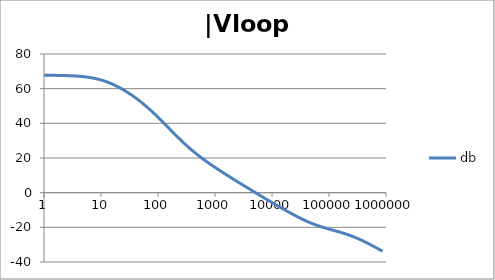
| Category | db |
|---|---|
| 1.0 | 67.728 |
| 1.0715193052376064 | 67.722 |
| 1.1481536214968828 | 67.716 |
| 1.2302687708123814 | 67.709 |
| 1.318256738556407 | 67.7 |
| 1.4125375446227544 | 67.691 |
| 1.513561248436208 | 67.68 |
| 1.6218100973589298 | 67.668 |
| 1.7378008287493754 | 67.653 |
| 1.8620871366628673 | 67.637 |
| 1.9952623149688797 | 67.618 |
| 2.1379620895022318 | 67.597 |
| 2.2908676527677727 | 67.573 |
| 2.45470891568503 | 67.545 |
| 2.6302679918953817 | 67.513 |
| 2.8183829312644537 | 67.477 |
| 3.0199517204020156 | 67.436 |
| 3.235936569296282 | 67.389 |
| 3.467368504525316 | 67.336 |
| 3.7153522909717256 | 67.276 |
| 3.9810717055349727 | 67.208 |
| 4.265795188015926 | 67.131 |
| 4.570881896148749 | 67.044 |
| 4.897788193684462 | 66.946 |
| 5.2480746024977245 | 66.836 |
| 5.62341325190349 | 66.713 |
| 6.025595860743575 | 66.575 |
| 6.456542290346554 | 66.423 |
| 6.918309709189363 | 66.253 |
| 7.4131024130091765 | 66.066 |
| 7.943282347242814 | 65.859 |
| 8.511380382023765 | 65.633 |
| 9.120108393559095 | 65.386 |
| 9.772372209558105 | 65.117 |
| 10.47128548050899 | 64.826 |
| 11.22018454301963 | 64.513 |
| 12.022644346174127 | 64.176 |
| 12.88249551693134 | 63.817 |
| 13.803842646028851 | 63.434 |
| 14.791083881682074 | 63.028 |
| 15.848931924611136 | 62.599 |
| 16.98243652461744 | 62.148 |
| 18.197008586099834 | 61.676 |
| 19.498445997580447 | 61.181 |
| 20.892961308540382 | 60.665 |
| 22.387211385683386 | 60.128 |
| 23.988329190194897 | 59.571 |
| 25.703957827688622 | 58.994 |
| 27.54228703338165 | 58.396 |
| 29.51209226666385 | 57.778 |
| 31.62277660168379 | 57.14 |
| 33.884415613920254 | 56.482 |
| 36.307805477010106 | 55.804 |
| 38.90451449942804 | 55.104 |
| 41.686938347033525 | 54.384 |
| 44.6683592150963 | 53.643 |
| 47.86300923226381 | 52.881 |
| 51.28613839913647 | 52.098 |
| 54.95408738576247 | 51.293 |
| 58.88436553555889 | 50.467 |
| 63.09573444801931 | 49.62 |
| 67.60829753919813 | 48.752 |
| 72.44359600749901 | 47.866 |
| 77.62471166286915 | 46.96 |
| 83.17637711026705 | 46.037 |
| 89.12509381337456 | 45.098 |
| 95.49925860214357 | 44.143 |
| 102.32929922807544 | 43.176 |
| 109.64781961431841 | 42.197 |
| 117.48975549395293 | 41.21 |
| 125.89254117941665 | 40.214 |
| 134.89628825916537 | 39.214 |
| 144.54397707459273 | 38.21 |
| 154.88166189124806 | 37.205 |
| 165.95869074375608 | 36.202 |
| 177.82794100389225 | 35.201 |
| 190.5460717963248 | 34.206 |
| 204.17379446695278 | 33.219 |
| 218.77616239495524 | 32.241 |
| 234.42288153199212 | 31.273 |
| 251.18864315095806 | 30.319 |
| 269.15348039269156 | 29.378 |
| 288.4031503126605 | 28.453 |
| 309.0295432513591 | 27.544 |
| 331.1311214825911 | 26.653 |
| 354.81338923357566 | 25.779 |
| 380.18939632056095 | 24.923 |
| 407.3802778041123 | 24.085 |
| 436.5158322401654 | 23.265 |
| 467.7351412871979 | 22.463 |
| 501.18723362727184 | 21.678 |
| 537.0317963702526 | 20.909 |
| 575.4399373371566 | 20.156 |
| 616.5950018614822 | 19.418 |
| 660.6934480075952 | 18.693 |
| 707.9457843841375 | 17.982 |
| 758.5775750291831 | 17.282 |
| 812.8305161640983 | 16.593 |
| 870.9635899560801 | 15.914 |
| 933.2543007969903 | 15.243 |
| 999.9999999999998 | 14.581 |
| 1071.5193052376057 | 13.926 |
| 1148.1536214968828 | 13.278 |
| 1230.2687708123801 | 12.635 |
| 1318.2567385564053 | 11.998 |
| 1412.537544622753 | 11.366 |
| 1513.5612484362066 | 10.737 |
| 1621.8100973589292 | 10.112 |
| 1737.8008287493742 | 9.491 |
| 1862.0871366628671 | 8.872 |
| 1995.2623149688786 | 8.256 |
| 2137.9620895022326 | 7.642 |
| 2290.867652767771 | 7.03 |
| 2454.708915685027 | 6.421 |
| 2630.26799189538 | 5.812 |
| 2818.382931264451 | 5.206 |
| 3019.9517204020176 | 4.6 |
| 3235.9365692962774 | 3.996 |
| 3467.368504525316 | 3.394 |
| 3715.352290971724 | 2.792 |
| 3981.07170553497 | 2.192 |
| 4265.795188015923 | 1.592 |
| 4570.881896148745 | 0.994 |
| 4897.788193684463 | 0.397 |
| 5248.074602497726 | -0.199 |
| 5623.413251903489 | -0.794 |
| 6025.595860743574 | -1.387 |
| 6456.54229034655 | -1.979 |
| 6918.309709189357 | -2.57 |
| 7413.102413009165 | -3.159 |
| 7943.282347242815 | -3.747 |
| 8511.380382023763 | -4.332 |
| 9120.108393559092 | -4.916 |
| 9772.3722095581 | -5.498 |
| 10471.285480509003 | -6.077 |
| 11220.184543019639 | -6.654 |
| 12022.64434617411 | -7.228 |
| 12882.495516931338 | -7.799 |
| 13803.842646028841 | -8.367 |
| 14791.083881682063 | -8.932 |
| 15848.931924611119 | -9.493 |
| 16982.436524617453 | -10.049 |
| 18197.008586099837 | -10.601 |
| 19498.445997580417 | -11.148 |
| 20892.961308540387 | -11.69 |
| 22387.211385683382 | -12.225 |
| 23988.32919019488 | -12.753 |
| 25703.957827688606 | -13.273 |
| 27542.28703338167 | -13.785 |
| 29512.092266663854 | -14.288 |
| 31622.77660168378 | -14.781 |
| 33884.41561392023 | -15.263 |
| 36307.805477010166 | -15.732 |
| 38904.514499428085 | -16.19 |
| 41686.93834703348 | -16.633 |
| 44668.35921509631 | -17.063 |
| 47863.00923226382 | -17.478 |
| 51286.13839913646 | -17.878 |
| 54954.08738576241 | -18.262 |
| 58884.365535558936 | -18.632 |
| 63095.73444801934 | -18.986 |
| 67608.29753919817 | -19.325 |
| 72443.59600749899 | -19.651 |
| 77624.71166286913 | -19.965 |
| 83176.37711026703 | -20.267 |
| 89125.09381337445 | -20.558 |
| 95499.25860214363 | -20.842 |
| 102329.29922807543 | -21.119 |
| 109647.81961431848 | -21.392 |
| 117489.75549395289 | -21.663 |
| 125892.54117941685 | -21.934 |
| 134896.28825916522 | -22.207 |
| 144543.97707459255 | -22.484 |
| 154881.66189124787 | -22.768 |
| 165958.69074375575 | -23.06 |
| 177827.9410038922 | -23.361 |
| 190546.07179632425 | -23.674 |
| 204173.79446695274 | -24 |
| 218776.16239495497 | -24.34 |
| 234422.88153199226 | -24.694 |
| 251188.64315095753 | -25.063 |
| 269153.480392691 | -25.448 |
| 288403.15031266044 | -25.848 |
| 309029.5432513582 | -26.263 |
| 331131.1214825907 | -26.693 |
| 354813.3892335749 | -27.136 |
| 380189.3963205612 | -27.594 |
| 407380.2778041119 | -28.064 |
| 436515.8322401649 | -28.546 |
| 467735.14128719777 | -29.038 |
| 501187.2336272717 | -29.541 |
| 537031.7963702519 | -30.052 |
| 575439.9373371559 | -30.571 |
| 616595.001861482 | -31.096 |
| 660693.4480075944 | -31.628 |
| 707945.7843841374 | -32.164 |
| 758577.575029183 | -32.705 |
| 812830.5161640996 | -33.249 |
| 870963.5899560791 | -33.795 |